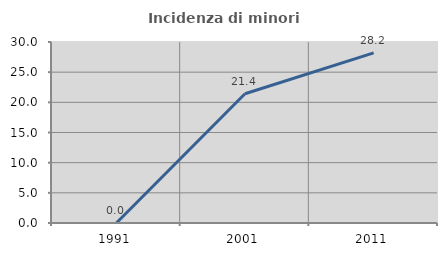
| Category | Incidenza di minori stranieri |
|---|---|
| 1991.0 | 0 |
| 2001.0 | 21.429 |
| 2011.0 | 28.205 |